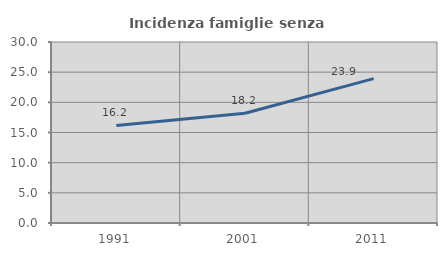
| Category | Incidenza famiglie senza nuclei |
|---|---|
| 1991.0 | 16.167 |
| 2001.0 | 18.193 |
| 2011.0 | 23.934 |